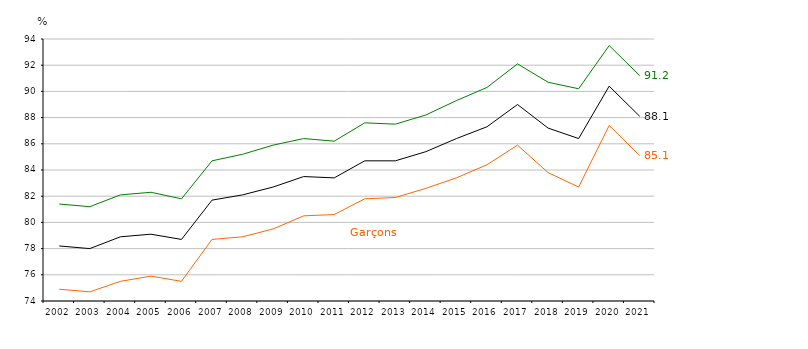
| Category | Garçons | Filles | Ensemble |
|---|---|---|---|
| 2002.0 | 74.9 | 81.4 | 78.2 |
| 2003.0 | 74.7 | 81.2 | 78 |
| 2004.0 | 75.5 | 82.1 | 78.9 |
| 2005.0 | 75.9 | 82.3 | 79.1 |
| 2006.0 | 75.5 | 81.8 | 78.7 |
| 2007.0 | 78.7 | 84.7 | 81.7 |
| 2008.0 | 78.9 | 85.2 | 82.1 |
| 2009.0 | 79.5 | 85.9 | 82.7 |
| 2010.0 | 80.5 | 86.4 | 83.5 |
| 2011.0 | 80.6 | 86.2 | 83.4 |
| 2012.0 | 81.8 | 87.6 | 84.7 |
| 2013.0 | 81.9 | 87.5 | 84.7 |
| 2014.0 | 82.6 | 88.2 | 85.4 |
| 2015.0 | 83.4 | 89.3 | 86.4 |
| 2016.0 | 84.4 | 90.3 | 87.3 |
| 2017.0 | 85.9 | 92.1 | 89 |
| 2018.0 | 83.8 | 90.7 | 87.2 |
| 2019.0 | 82.7 | 90.2 | 86.4 |
| 2020.0 | 87.4 | 93.5 | 90.4 |
| 2021.0 | 85.1 | 91.2 | 88.1 |